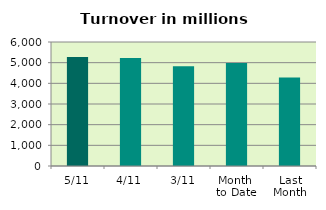
| Category | Series 0 |
|---|---|
| 5/11 | 5270.36 |
| 4/11 | 5227.583 |
| 3/11 | 4821.295 |
| Month 
to Date | 4980.173 |
| Last
Month | 4277.774 |